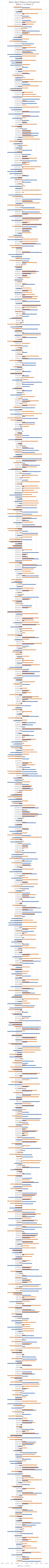
| Category | Stock 1 | Stock 2 |
|---|---|---|
| 1/1/16 | 0.19 | -0.05 |
| 1/2/16 | 0.07 | 0.2 |
| 1/3/16 | 0.07 | 0.03 |
| 1/4/16 | -0.11 | -0.01 |
| 1/5/16 | 0.09 | 0.19 |
| 1/6/16 | 0.02 | 0.03 |
| 1/7/16 | -0.14 | 0.15 |
| 1/8/16 | 0.03 | 0.09 |
| 1/9/16 | -0.06 | 0.05 |
| 1/10/16 | -0.01 | 0.15 |
| 1/11/16 | 0.06 | 0.09 |
| 1/12/16 | 0.04 | 0.17 |
| 1/13/16 | -0.08 | 0 |
| 1/14/16 | 0.11 | -0.02 |
| 1/15/16 | -0.15 | 0.02 |
| 1/16/16 | -0.02 | 0.02 |
| 1/17/16 | -0.07 | 0.1 |
| 1/18/16 | 0.14 | 0.03 |
| 1/19/16 | 0.19 | 0.09 |
| 1/20/16 | -0.06 | -0.04 |
| 1/21/16 | -0.03 | 0.11 |
| 1/22/16 | -0.05 | -0.13 |
| 1/23/16 | 0.1 | -0.07 |
| 1/24/16 | -0.07 | 0.15 |
| 1/25/16 | 0.11 | 0.05 |
| 1/26/16 | -0.1 | -0.14 |
| 1/27/16 | -0.04 | 0.01 |
| 1/28/16 | 0.06 | 0.2 |
| 1/29/16 | 0 | 0.1 |
| 1/30/16 | -0.12 | -0.09 |
| 1/31/16 | 0.01 | -0.11 |
| 2/1/16 | -0.03 | 0.15 |
| 2/2/16 | 0.2 | 0.11 |
| 2/3/16 | -0.05 | -0.01 |
| 2/4/16 | 0.04 | 0.13 |
| 2/5/16 | -0.09 | -0.11 |
| 2/6/16 | 0.08 | -0.01 |
| 2/7/16 | -0.04 | 0.09 |
| 2/8/16 | 0.06 | 0.2 |
| 2/9/16 | 0.01 | 0.12 |
| 2/10/16 | 0.09 | 0.08 |
| 2/11/16 | -0.15 | 0.01 |
| 2/12/16 | -0.04 | -0.11 |
| 2/13/16 | 0.2 | 0.13 |
| 2/14/16 | 0.17 | 0.16 |
| 2/15/16 | -0.03 | 0.15 |
| 2/16/16 | -0.12 | -0.05 |
| 2/17/16 | -0.13 | 0.04 |
| 2/18/16 | 0.09 | 0.01 |
| 2/19/16 | -0.06 | 0.19 |
| 2/20/16 | -0.07 | 0.13 |
| 2/21/16 | 0.15 | -0.02 |
| 2/22/16 | -0.09 | -0.05 |
| 2/23/16 | -0.03 | 0.05 |
| 2/24/16 | -0.04 | 0.03 |
| 2/25/16 | 0.11 | 0.13 |
| 2/26/16 | 0.14 | 0.04 |
| 2/27/16 | -0.01 | -0.13 |
| 2/28/16 | 0.19 | -0.15 |
| 2/29/16 | -0.12 | -0.12 |
| 3/1/16 | 0.17 | 0.13 |
| 3/2/16 | 0.03 | 0.07 |
| 3/3/16 | 0.12 | -0.01 |
| 3/4/16 | -0.03 | -0.06 |
| 3/5/16 | -0.01 | -0.02 |
| 3/6/16 | 0.1 | 0.13 |
| 3/7/16 | 0.11 | 0.06 |
| 3/8/16 | -0.14 | 0.05 |
| 3/9/16 | 0.01 | -0.14 |
| 3/10/16 | 0.09 | 0.01 |
| 3/11/16 | 0.02 | -0.1 |
| 3/12/16 | 0.14 | 0.11 |
| 3/13/16 | -0.11 | 0.02 |
| 3/14/16 | 0.03 | -0.09 |
| 3/15/16 | -0.15 | 0.19 |
| 3/16/16 | 0 | 0.15 |
| 3/17/16 | -0.15 | -0.07 |
| 3/18/16 | -0.07 | 0.04 |
| 3/19/16 | 0.06 | -0.1 |
| 3/20/16 | 0.13 | -0.02 |
| 3/21/16 | 0.02 | -0.1 |
| 3/22/16 | 0.04 | 0.07 |
| 3/23/16 | 0.01 | 0.17 |
| 3/24/16 | -0.13 | 0.18 |
| 3/25/16 | 0.17 | -0.12 |
| 3/26/16 | -0.03 | 0.19 |
| 3/27/16 | -0.08 | -0.12 |
| 3/28/16 | 0.06 | -0.15 |
| 3/29/16 | 0.13 | 0.1 |
| 3/30/16 | 0.1 | 0 |
| 3/31/16 | 0 | 0.2 |
| 4/1/16 | -0.02 | 0 |
| 4/2/16 | 0.1 | 0.09 |
| 4/3/16 | -0.15 | -0.05 |
| 4/4/16 | -0.07 | 0.14 |
| 4/5/16 | 0.15 | -0.11 |
| 4/6/16 | 0.14 | 0.01 |
| 4/7/16 | 0.02 | 0.02 |
| 4/8/16 | -0.1 | -0.11 |
| 4/9/16 | -0.03 | -0.12 |
| 4/10/16 | 0 | 0.18 |
| 4/11/16 | 0.03 | -0.13 |
| 4/12/16 | 0.08 | 0.1 |
| 4/13/16 | 0.15 | -0.11 |
| 4/14/16 | 0.04 | 0.01 |
| 4/15/16 | 0.2 | -0.13 |
| 4/16/16 | 0.12 | 0.03 |
| 4/17/16 | 0.01 | 0 |
| 4/18/16 | -0.04 | 0.12 |
| 4/19/16 | -0.11 | 0.12 |
| 4/20/16 | -0.15 | 0.08 |
| 4/21/16 | 0.02 | 0.08 |
| 4/22/16 | -0.07 | 0.14 |
| 4/23/16 | -0.11 | 0.06 |
| 4/24/16 | 0.07 | -0.04 |
| 4/25/16 | -0.1 | -0.01 |
| 4/26/16 | -0.06 | -0.11 |
| 4/27/16 | 0.16 | 0.18 |
| 4/28/16 | 0.13 | 0.09 |
| 4/29/16 | -0.07 | -0.14 |
| 4/30/16 | 0.09 | 0.19 |
| 5/1/16 | 0.02 | -0.06 |
| 5/2/16 | -0.13 | 0.08 |
| 5/3/16 | 0.13 | 0.14 |
| 5/4/16 | 0.02 | 0.14 |
| 5/5/16 | 0.09 | -0.09 |
| 5/6/16 | -0.09 | -0.15 |
| 5/7/16 | 0.17 | -0.02 |
| 5/8/16 | 0.2 | -0.08 |
| 5/9/16 | -0.03 | 0.17 |
| 5/10/16 | 0.19 | -0.14 |
| 5/11/16 | 0.05 | 0.1 |
| 5/12/16 | 0.08 | 0.09 |
| 5/13/16 | 0.05 | -0.07 |
| 5/14/16 | 0.2 | 0.04 |
| 5/15/16 | 0.01 | -0.03 |
| 5/16/16 | -0.06 | -0.12 |
| 5/17/16 | 0.17 | 0.09 |
| 5/18/16 | 0.08 | 0.1 |
| 5/19/16 | -0.15 | -0.01 |
| 5/20/16 | 0.1 | -0.03 |
| 5/21/16 | 0.04 | 0.08 |
| 5/22/16 | -0.1 | -0.08 |
| 5/23/16 | -0.06 | 0.1 |
| 5/24/16 | 0.02 | 0.12 |
| 5/25/16 | -0.1 | -0.03 |
| 5/26/16 | -0.1 | -0.1 |
| 5/27/16 | -0.13 | 0.14 |
| 5/28/16 | -0.01 | 0.07 |
| 5/29/16 | -0.05 | 0.17 |
| 5/30/16 | 0.11 | 0.11 |
| 5/31/16 | -0.06 | 0.16 |
| 6/1/16 | 0.08 | 0.13 |
| 6/2/16 | 0.14 | 0.16 |
| 6/3/16 | 0.16 | 0.03 |
| 6/4/16 | 0.02 | -0.15 |
| 6/5/16 | 0.13 | -0.08 |
| 6/6/16 | 0.2 | 0.04 |
| 6/7/16 | -0.14 | 0.2 |
| 6/8/16 | 0.15 | -0.05 |
| 6/9/16 | 0.12 | 0.16 |
| 6/10/16 | -0.14 | 0.09 |
| 6/11/16 | 0.13 | 0.04 |
| 6/12/16 | 0.14 | 0.19 |
| 6/13/16 | 0.13 | -0.15 |
| 6/14/16 | -0.09 | 0.14 |
| 6/15/16 | -0.13 | -0.07 |
| 6/16/16 | -0.01 | -0.07 |
| 6/17/16 | 0.11 | -0.12 |
| 6/18/16 | 0.14 | -0.15 |
| 6/19/16 | 0.08 | 0.1 |
| 6/20/16 | -0.14 | 0.1 |
| 6/21/16 | 0.13 | 0.15 |
| 6/22/16 | 0.15 | 0 |
| 6/23/16 | -0.04 | -0.06 |
| 6/24/16 | 0.06 | -0.12 |
| 6/25/16 | -0.09 | 0.1 |
| 6/26/16 | 0.09 | -0.12 |
| 6/27/16 | 0.17 | 0.12 |
| 6/28/16 | 0 | 0.08 |
| 6/29/16 | 0.1 | 0 |
| 6/30/16 | -0.06 | -0.15 |
| 7/1/16 | 0.09 | 0.02 |
| 7/2/16 | -0.03 | -0.05 |
| 7/3/16 | -0.12 | -0.08 |
| 7/4/16 | 0.18 | 0.07 |
| 7/5/16 | 0.03 | -0.04 |
| 7/6/16 | -0.08 | 0.18 |
| 7/7/16 | -0.01 | 0.19 |
| 7/8/16 | 0 | -0.02 |
| 7/9/16 | 0.11 | -0.06 |
| 7/10/16 | 0.1 | -0.13 |
| 7/11/16 | 0.01 | -0.05 |
| 7/12/16 | 0.03 | -0.02 |
| 7/13/16 | 0.19 | -0.14 |
| 7/14/16 | 0.01 | 0.08 |
| 7/15/16 | -0.07 | -0.11 |
| 7/16/16 | 0.14 | 0.16 |
| 7/17/16 | -0.06 | 0.18 |
| 7/18/16 | 0.13 | -0.05 |
| 7/19/16 | 0.03 | 0.06 |
| 7/20/16 | 0.02 | 0.06 |
| 7/21/16 | 0.14 | 0.16 |
| 7/22/16 | 0.03 | 0.05 |
| 7/23/16 | 0.06 | -0.14 |
| 7/24/16 | -0.06 | 0.07 |
| 7/25/16 | 0.06 | -0.03 |
| 7/26/16 | 0.04 | 0.18 |
| 7/27/16 | 0.19 | -0.07 |
| 7/28/16 | 0.06 | -0.1 |
| 7/29/16 | 0.2 | -0.05 |
| 7/30/16 | 0.07 | -0.04 |
| 7/31/16 | -0.1 | 0.04 |
| 8/1/16 | -0.06 | -0.08 |
| 8/2/16 | 0.12 | 0.12 |
| 8/3/16 | -0.08 | 0.09 |
| 8/4/16 | 0.18 | 0 |
| 8/5/16 | -0.13 | -0.06 |
| 8/6/16 | -0.06 | 0.17 |
| 8/7/16 | 0.09 | 0.18 |
| 8/8/16 | 0.01 | -0.09 |
| 8/9/16 | 0.1 | 0.15 |
| 8/10/16 | 0.04 | -0.04 |
| 8/11/16 | 0.06 | 0.08 |
| 8/12/16 | -0.14 | 0.18 |
| 8/13/16 | -0.03 | -0.11 |
| 8/14/16 | 0 | 0.07 |
| 8/15/16 | 0.16 | -0.13 |
| 8/16/16 | -0.02 | -0.03 |
| 8/17/16 | 0.15 | 0.18 |
| 8/18/16 | -0.01 | -0.14 |
| 8/19/16 | -0.09 | -0.11 |
| 8/20/16 | 0.2 | -0.12 |
| 8/21/16 | 0.14 | 0.04 |
| 8/22/16 | 0.06 | -0.1 |
| 8/23/16 | 0.12 | -0.08 |
| 8/24/16 | 0.01 | -0.02 |
| 8/25/16 | -0.13 | -0.07 |
| 8/26/16 | -0.05 | -0.13 |
| 8/27/16 | -0.05 | 0.13 |
| 8/28/16 | -0.09 | 0.19 |
| 8/29/16 | -0.04 | 0.18 |
| 8/30/16 | 0.19 | 0 |
| 8/31/16 | -0.11 | -0.14 |
| 9/1/16 | 0.05 | 0.15 |
| 9/2/16 | -0.07 | 0.15 |
| 9/3/16 | 0.13 | 0.15 |
| 9/4/16 | -0.11 | -0.1 |
| 9/5/16 | 0.18 | 0 |
| 9/6/16 | -0.15 | 0.03 |
| 9/7/16 | 0.19 | 0.17 |
| 9/8/16 | 0.19 | -0.08 |
| 9/9/16 | -0.14 | -0.1 |
| 9/10/16 | -0.13 | -0.14 |
| 9/11/16 | 0.19 | -0.03 |
| 9/12/16 | 0.01 | 0.07 |
| 9/13/16 | 0.09 | -0.01 |
| 9/14/16 | -0.09 | -0.11 |
| 9/15/16 | 0.06 | 0.01 |
| 9/16/16 | -0.02 | -0.14 |
| 9/17/16 | -0.13 | 0.12 |
| 9/18/16 | 0.13 | -0.08 |
| 9/19/16 | -0.15 | 0.08 |
| 9/20/16 | -0.04 | 0.05 |
| 9/21/16 | 0.01 | 0.17 |
| 9/22/16 | -0.11 | -0.1 |
| 9/23/16 | -0.08 | 0.19 |
| 9/24/16 | 0.13 | 0.08 |
| 9/25/16 | 0.06 | -0.14 |
| 9/26/16 | 0.12 | 0.08 |
| 9/27/16 | -0.12 | 0.2 |
| 9/28/16 | 0 | -0.02 |
| 9/29/16 | 0.16 | 0.07 |
| 9/30/16 | 0.03 | 0.17 |
| 10/1/16 | -0.07 | -0.03 |
| 10/2/16 | 0.09 | -0.06 |
| 10/3/16 | -0.11 | 0.05 |
| 10/4/16 | -0.07 | 0.07 |
| 10/5/16 | -0.11 | -0.12 |
| 10/6/16 | -0.06 | 0.08 |
| 10/7/16 | -0.1 | -0.13 |
| 10/8/16 | 0.12 | -0.02 |
| 10/9/16 | 0.19 | 0.11 |
| 10/10/16 | -0.03 | 0.19 |
| 10/11/16 | -0.1 | 0.07 |
| 10/12/16 | 0.08 | 0.17 |
| 10/13/16 | -0.03 | -0.02 |
| 10/14/16 | -0.01 | -0.05 |
| 10/15/16 | -0.04 | 0.14 |
| 10/16/16 | -0.12 | 0.07 |
| 10/17/16 | 0.07 | 0.01 |
| 10/18/16 | -0.11 | -0.05 |
| 10/19/16 | -0.08 | 0.14 |
| 10/20/16 | 0.02 | 0 |
| 10/21/16 | -0.01 | 0.14 |
| 10/22/16 | 0.02 | 0.05 |
| 10/23/16 | 0.12 | -0.06 |
| 10/24/16 | 0.06 | 0.14 |
| 10/25/16 | -0.03 | 0.15 |
| 10/26/16 | -0.14 | 0 |
| 10/27/16 | -0.14 | 0.15 |
| 10/28/16 | -0.12 | 0.11 |
| 10/29/16 | -0.11 | 0.01 |
| 10/30/16 | 0.03 | -0.08 |
| 10/31/16 | 0.13 | 0.13 |
| 11/1/16 | 0.2 | 0 |
| 11/2/16 | 0.11 | 0.06 |
| 11/3/16 | 0.19 | 0.14 |
| 11/4/16 | 0.04 | -0.1 |
| 11/5/16 | -0.02 | -0.03 |
| 11/6/16 | 0.17 | 0.01 |
| 11/7/16 | -0.01 | -0.03 |
| 11/8/16 | 0.13 | 0.07 |
| 11/9/16 | 0.07 | 0.14 |
| 11/10/16 | 0.08 | -0.14 |
| 11/11/16 | -0.06 | 0.03 |
| 11/12/16 | 0.07 | -0.02 |
| 11/13/16 | 0.12 | -0.11 |
| 11/14/16 | -0.01 | 0.16 |
| 11/15/16 | 0.06 | 0.05 |
| 11/16/16 | -0.06 | 0.16 |
| 11/17/16 | -0.11 | 0.06 |
| 11/18/16 | -0.03 | 0.03 |
| 11/19/16 | 0.15 | 0.1 |
| 11/20/16 | -0.13 | 0 |
| 11/21/16 | -0.1 | 0.12 |
| 11/22/16 | -0.02 | -0.05 |
| 11/23/16 | 0.09 | 0.08 |
| 11/24/16 | 0.09 | -0.11 |
| 11/25/16 | 0.1 | 0.02 |
| 11/26/16 | 0.16 | -0.13 |
| 11/27/16 | -0.11 | 0.06 |
| 11/28/16 | -0.11 | 0.02 |
| 11/29/16 | 0.14 | -0.07 |
| 11/30/16 | 0.02 | 0 |
| 12/1/16 | 0.01 | 0.06 |
| 12/2/16 | 0.06 | 0.06 |
| 12/3/16 | 0.09 | -0.04 |
| 12/4/16 | -0.12 | 0.02 |
| 12/5/16 | -0.02 | -0.12 |
| 12/6/16 | -0.1 | 0.2 |
| 12/7/16 | 0.09 | -0.15 |
| 12/8/16 | -0.1 | 0.05 |
| 12/9/16 | -0.13 | -0.05 |
| 12/10/16 | 0.07 | 0.06 |
| 12/11/16 | -0.14 | 0 |
| 12/12/16 | -0.07 | -0.05 |
| 12/13/16 | 0.14 | 0.04 |
| 12/14/16 | -0.06 | -0.01 |
| 12/15/16 | -0.04 | 0.02 |
| 12/16/16 | 0.13 | 0.16 |
| 12/17/16 | 0.2 | 0.16 |
| 12/18/16 | 0.08 | 0.07 |
| 12/19/16 | 0.05 | 0.01 |
| 12/20/16 | 0.17 | 0.13 |
| 12/21/16 | -0.12 | 0.13 |
| 12/22/16 | -0.03 | -0.1 |
| 12/23/16 | -0.11 | 0.06 |
| 12/24/16 | -0.14 | -0.06 |
| 12/25/16 | 0 | -0.15 |
| 12/26/16 | -0.12 | -0.1 |
| 12/27/16 | 0 | -0.05 |
| 12/28/16 | -0.03 | 0.1 |
| 12/29/16 | 0.11 | 0.08 |
| 12/30/16 | 0.09 | 0.1 |
| 12/31/16 | 0.07 | -0.07 |
| 1/1/17 | -0.15 | 0.08 |
| 1/2/17 | -0.08 | 0.02 |
| 1/3/17 | -0.09 | -0.04 |
| 1/4/17 | 0.2 | 0.06 |
| 1/5/17 | 0.16 | -0.14 |
| 1/6/17 | 0.15 | -0.15 |
| 1/7/17 | 0.14 | 0.02 |
| 1/8/17 | 0.08 | -0.03 |
| 1/9/17 | 0.04 | 0.13 |
| 1/10/17 | 0.06 | 0.1 |
| 1/11/17 | 0 | 0 |
| 1/12/17 | 0.07 | -0.14 |
| 1/13/17 | 0.03 | -0.15 |
| 1/14/17 | -0.14 | 0.07 |
| 1/15/17 | -0.12 | 0.15 |
| 1/16/17 | -0.06 | 0.12 |
| 1/17/17 | -0.02 | -0.11 |
| 1/18/17 | -0.12 | 0.09 |
| 1/19/17 | -0.09 | 0.02 |
| 1/20/17 | -0.11 | 0.05 |
| 1/21/17 | 0.09 | 0.14 |
| 1/22/17 | 0.01 | 0.03 |
| 1/23/17 | 0.12 | 0.07 |
| 1/24/17 | -0.04 | 0 |
| 1/25/17 | 0.12 | -0.02 |
| 1/26/17 | 0.2 | 0.19 |
| 1/27/17 | 0.03 | -0.01 |
| 1/28/17 | 0.11 | 0.04 |
| 1/29/17 | 0.14 | 0.04 |
| 1/30/17 | -0.09 | 0.05 |
| 1/31/17 | -0.01 | -0.14 |
| 2/1/17 | 0.17 | 0.07 |
| 2/2/17 | -0.05 | -0.03 |
| 2/3/17 | 0.01 | 0.1 |
| 2/4/17 | -0.02 | -0.1 |
| 2/5/17 | -0.07 | 0 |
| 2/6/17 | 0.09 | -0.15 |
| 2/7/17 | -0.01 | -0.02 |
| 2/8/17 | 0.16 | 0.03 |
| 2/9/17 | 0.06 | 0.2 |
| 2/10/17 | 0.1 | 0.17 |
| 2/11/17 | -0.03 | -0.13 |
| 2/12/17 | 0.04 | 0.09 |
| 2/13/17 | 0.06 | 0.08 |
| 2/14/17 | -0.02 | 0.05 |
| 2/15/17 | 0 | -0.02 |
| 2/16/17 | 0.08 | -0.09 |
| 2/17/17 | -0.02 | 0.13 |
| 2/18/17 | -0.06 | -0.06 |
| 2/19/17 | -0.09 | 0.01 |
| 2/20/17 | 0.18 | -0.05 |
| 2/21/17 | 0.13 | 0.12 |
| 2/22/17 | 0.18 | 0.06 |
| 2/23/17 | 0.07 | -0.15 |
| 2/24/17 | -0.13 | -0.01 |
| 2/25/17 | 0.09 | 0.18 |
| 2/26/17 | -0.05 | 0.11 |
| 2/27/17 | 0.01 | 0.12 |
| 2/28/17 | 0.02 | -0.06 |
| 3/1/17 | -0.05 | 0.07 |
| 3/2/17 | 0 | -0.07 |
| 3/3/17 | -0.02 | -0.1 |
| 3/4/17 | -0.09 | 0.14 |
| 3/5/17 | -0.04 | 0.04 |
| 3/6/17 | 0.07 | -0.14 |
| 3/7/17 | 0.12 | 0.2 |
| 3/8/17 | 0 | 0.02 |
| 3/9/17 | -0.08 | 0.07 |
| 3/10/17 | 0.17 | 0.13 |
| 3/11/17 | -0.05 | -0.15 |
| 3/12/17 | -0.01 | 0.03 |
| 3/13/17 | -0.02 | 0.12 |
| 3/14/17 | -0.03 | 0.1 |
| 3/15/17 | -0.12 | -0.03 |
| 3/16/17 | 0.14 | 0.18 |
| 3/17/17 | -0.09 | 0.17 |
| 3/18/17 | 0.02 | 0.12 |
| 3/19/17 | 0.11 | 0.17 |
| 3/20/17 | 0 | -0.01 |
| 3/21/17 | -0.06 | 0.16 |
| 3/22/17 | -0.15 | -0.15 |
| 3/23/17 | 0 | 0 |
| 3/24/17 | 0.06 | 0.09 |
| 3/25/17 | 0.1 | -0.02 |
| 3/26/17 | 0.01 | -0.07 |
| 3/27/17 | -0.06 | -0.1 |
| 3/28/17 | 0.07 | 0.09 |
| 3/29/17 | 0.17 | -0.08 |
| 3/30/17 | -0.04 | 0.02 |
| 3/31/17 | 0 | -0.05 |
| 4/1/17 | 0.07 | 0.11 |
| 4/2/17 | -0.13 | 0.12 |
| 4/3/17 | -0.05 | 0.01 |
| 4/4/17 | 0.14 | -0.04 |
| 4/5/17 | -0.11 | -0.08 |
| 4/6/17 | 0 | -0.11 |
| 4/7/17 | 0 | 0.17 |
| 4/8/17 | 0.17 | 0.03 |
| 4/9/17 | -0.04 | 0.12 |
| 4/10/17 | 0 | 0.09 |
| 4/11/17 | -0.08 | 0.12 |
| 4/12/17 | 0.14 | 0.01 |
| 4/13/17 | 0.2 | 0.15 |
| 4/14/17 | -0.03 | -0.13 |
| 4/15/17 | -0.07 | 0.1 |
| 4/16/17 | 0.17 | 0.12 |
| 4/17/17 | 0.06 | 0.04 |
| 4/18/17 | 0.04 | 0.06 |
| 4/19/17 | 0.17 | 0 |
| 4/20/17 | 0.01 | 0.1 |
| 4/21/17 | -0.15 | -0.14 |
| 4/22/17 | -0.09 | -0.1 |
| 4/23/17 | -0.07 | -0.04 |
| 4/24/17 | -0.12 | -0.14 |
| 4/25/17 | 0.1 | -0.13 |
| 4/26/17 | -0.01 | 0.1 |
| 4/27/17 | -0.05 | 0.16 |
| 4/28/17 | 0.16 | -0.02 |
| 4/29/17 | 0.06 | -0.14 |
| 4/30/17 | -0.04 | -0.15 |
| 5/1/17 | 0.2 | 0.2 |
| 5/2/17 | 0.13 | 0 |
| 5/3/17 | -0.09 | 0.11 |
| 5/4/17 | 0.07 | 0.03 |
| 5/5/17 | 0.15 | 0.09 |
| 5/6/17 | -0.14 | 0.2 |
| 5/7/17 | 0.1 | -0.15 |
| 5/8/17 | 0.16 | -0.02 |
| 5/9/17 | -0.09 | -0.15 |
| 5/10/17 | 0.15 | -0.06 |
| 5/11/17 | -0.05 | 0.15 |
| 5/12/17 | -0.03 | 0.17 |
| 5/13/17 | -0.08 | 0.16 |
| 5/14/17 | -0.05 | -0.02 |
| 5/15/17 | -0.07 | 0.14 |
| 5/16/17 | -0.13 | 0.1 |
| 5/17/17 | -0.08 | 0.16 |
| 5/18/17 | 0.01 | 0.12 |
| 5/19/17 | 0.01 | 0.18 |
| 5/20/17 | 0.02 | 0.16 |
| 5/21/17 | -0.01 | -0.05 |
| 5/22/17 | -0.01 | 0.18 |
| 5/23/17 | 0.06 | 0 |
| 5/24/17 | -0.02 | 0.08 |
| 5/25/17 | 0.01 | 0.16 |
| 5/26/17 | 0.09 | -0.03 |
| 5/27/17 | 0.19 | 0.05 |
| 5/28/17 | -0.14 | -0.11 |
| 5/29/17 | 0.04 | 0.15 |
| 5/30/17 | 0.18 | 0.06 |
| 5/31/17 | 0.03 | -0.09 |
| 6/1/17 | 0.14 | 0.2 |
| 6/2/17 | 0.2 | -0.13 |
| 6/3/17 | -0.09 | -0.05 |
| 6/4/17 | -0.07 | 0.2 |
| 6/5/17 | 0.13 | -0.08 |
| 6/6/17 | 0.17 | -0.09 |
| 6/7/17 | 0.12 | 0.06 |
| 6/8/17 | 0.04 | -0.02 |
| 6/9/17 | -0.04 | -0.04 |
| 6/10/17 | -0.01 | 0.16 |
| 6/11/17 | -0.14 | -0.07 |
| 6/12/17 | 0.2 | -0.06 |
| 6/13/17 | 0.07 | -0.08 |
| 6/14/17 | -0.04 | -0.05 |
| 6/15/17 | 0.01 | 0 |
| 6/16/17 | -0.09 | -0.01 |
| 6/17/17 | -0.02 | 0.07 |
| 6/18/17 | -0.03 | 0.13 |
| 6/19/17 | 0.13 | 0.03 |
| 6/20/17 | -0.05 | -0.12 |
| 6/21/17 | 0.16 | -0.15 |
| 6/22/17 | 0.03 | 0.12 |
| 6/23/17 | -0.12 | 0.2 |
| 6/24/17 | 0 | 0.12 |
| 6/25/17 | -0.13 | -0.03 |
| 6/26/17 | 0.13 | -0.09 |
| 6/27/17 | 0.05 | 0.14 |
| 6/28/17 | -0.02 | 0.05 |
| 6/29/17 | 0.08 | 0.17 |
| 6/30/17 | 0.06 | -0.04 |
| 7/1/17 | -0.01 | 0.13 |
| 7/2/17 | -0.12 | 0.03 |
| 7/3/17 | -0.05 | 0.02 |
| 7/4/17 | 0.1 | 0.02 |
| 7/5/17 | -0.1 | -0.08 |
| 7/6/17 | 0.08 | 0 |
| 7/7/17 | 0.12 | 0.01 |
| 7/8/17 | 0.2 | -0.01 |
| 7/9/17 | -0.1 | 0.06 |
| 7/10/17 | -0.01 | 0.12 |
| 7/11/17 | 0.07 | 0.02 |
| 7/12/17 | -0.12 | -0.12 |
| 7/13/17 | 0.09 | 0.02 |
| 7/14/17 | -0.12 | 0.01 |
| 7/15/17 | -0.05 | -0.09 |
| 7/16/17 | 0.14 | 0.02 |
| 7/17/17 | 0.14 | -0.02 |
| 7/18/17 | -0.04 | -0.13 |
| 7/19/17 | 0.2 | 0.06 |
| 7/20/17 | 0.03 | 0.17 |
| 7/21/17 | -0.01 | -0.05 |
| 7/22/17 | 0.05 | 0.01 |
| 7/23/17 | -0.11 | -0.06 |
| 7/24/17 | -0.02 | -0.04 |
| 7/25/17 | 0.06 | -0.12 |
| 7/26/17 | 0 | 0.08 |
| 7/27/17 | -0.09 | -0.15 |
| 7/28/17 | -0.01 | -0.04 |
| 7/29/17 | 0.15 | 0.04 |
| 7/30/17 | -0.08 | 0.19 |
| 7/31/17 | 0.19 | 0.02 |
| 8/1/17 | -0.08 | -0.07 |
| 8/2/17 | 0.16 | -0.1 |
| 8/3/17 | -0.12 | -0.02 |
| 8/4/17 | 0.18 | -0.15 |
| 8/5/17 | -0.02 | 0.02 |
| 8/6/17 | 0.01 | 0.01 |
| 8/7/17 | -0.13 | -0.1 |
| 8/8/17 | 0.07 | -0.02 |
| 8/9/17 | 0.15 | 0.03 |
| 8/10/17 | 0.03 | -0.07 |
| 8/11/17 | 0.16 | 0.08 |
| 8/12/17 | 0.02 | 0.15 |
| 8/13/17 | 0.19 | 0.19 |
| 8/14/17 | -0.06 | -0.01 |
| 8/15/17 | 0.18 | 0.04 |
| 8/16/17 | -0.12 | 0.15 |
| 8/17/17 | 0.1 | 0.16 |
| 8/18/17 | 0.03 | 0.13 |
| 8/19/17 | -0.08 | 0.1 |
| 8/20/17 | 0.06 | 0.1 |
| 8/21/17 | -0.06 | 0.09 |
| 8/22/17 | -0.01 | 0.02 |
| 8/23/17 | 0.13 | 0.04 |
| 8/24/17 | 0 | -0.05 |
| 8/25/17 | -0.08 | 0.01 |
| 8/26/17 | -0.04 | 0.08 |
| 8/27/17 | 0.05 | 0.05 |
| 8/28/17 | 0.09 | 0.14 |
| 8/29/17 | 0.17 | 0.14 |
| 8/30/17 | -0.06 | 0 |
| 8/31/17 | -0.06 | -0.08 |
| 9/1/17 | -0.01 | 0.04 |
| 9/2/17 | 0.04 | 0.15 |
| 9/3/17 | 0.07 | -0.13 |
| 9/4/17 | 0.08 | -0.07 |
| 9/5/17 | -0.11 | 0 |
| 9/6/17 | -0.14 | 0.02 |
| 9/7/17 | 0.2 | 0.08 |
| 9/8/17 | 0 | -0.01 |
| 9/9/17 | -0.06 | -0.11 |
| 9/10/17 | 0.12 | -0.13 |
| 9/11/17 | 0.19 | 0.14 |
| 9/12/17 | -0.02 | 0.16 |
| 9/13/17 | -0.15 | 0.16 |
| 9/14/17 | 0.01 | -0.14 |
| 9/15/17 | -0.09 | 0 |
| 9/16/17 | -0.04 | 0.09 |
| 9/17/17 | 0.08 | 0.07 |
| 9/18/17 | 0.1 | 0.09 |
| 9/19/17 | 0.15 | -0.1 |
| 9/20/17 | 0.2 | 0.2 |
| 9/21/17 | 0.05 | 0.08 |
| 9/22/17 | -0.11 | 0.17 |
| 9/23/17 | 0.19 | 0.2 |
| 9/24/17 | -0.13 | -0.1 |
| 9/25/17 | 0.06 | 0.2 |
| 9/26/17 | 0.18 | 0.01 |
| 9/27/17 | -0.15 | 0.19 |
| 9/28/17 | 0.13 | -0.02 |
| 9/29/17 | 0.02 | -0.15 |
| 9/30/17 | -0.06 | 0.18 |
| 10/1/17 | 0.11 | 0.1 |
| 10/2/17 | 0.19 | 0 |
| 10/3/17 | 0.01 | -0.1 |
| 10/4/17 | -0.14 | 0.2 |
| 10/5/17 | 0 | 0.02 |
| 10/6/17 | 0 | 0.19 |
| 10/7/17 | -0.07 | 0.01 |
| 10/8/17 | -0.13 | 0.03 |
| 10/9/17 | 0.01 | -0.04 |
| 10/10/17 | 0.09 | 0.01 |
| 10/11/17 | 0.15 | -0.07 |
| 10/12/17 | -0.12 | -0.04 |
| 10/13/17 | 0.07 | 0.04 |
| 10/14/17 | -0.13 | 0.01 |
| 10/15/17 | -0.15 | -0.04 |
| 10/16/17 | -0.12 | 0.13 |
| 10/17/17 | 0.01 | 0.19 |
| 10/18/17 | -0.11 | 0.07 |
| 10/19/17 | 0.04 | 0.08 |
| 10/20/17 | 0.15 | -0.02 |
| 10/21/17 | 0.07 | 0.15 |
| 10/22/17 | 0.05 | 0.06 |
| 10/23/17 | 0.09 | -0.01 |
| 10/24/17 | -0.15 | -0.05 |
| 10/25/17 | 0.1 | -0.03 |
| 10/26/17 | -0.06 | -0.01 |
| 10/27/17 | -0.04 | 0.05 |
| 10/28/17 | -0.09 | 0.01 |
| 10/29/17 | -0.03 | -0.13 |
| 10/30/17 | -0.05 | 0.18 |
| 10/31/17 | -0.04 | 0.12 |
| 11/1/17 | 0.16 | 0.09 |
| 11/2/17 | 0.17 | 0.09 |
| 11/3/17 | 0.09 | 0.09 |
| 11/4/17 | 0.05 | -0.02 |
| 11/5/17 | -0.05 | -0.11 |
| 11/6/17 | -0.03 | 0.15 |
| 11/7/17 | 0.05 | 0.04 |
| 11/8/17 | 0.07 | -0.02 |
| 11/9/17 | -0.1 | 0.04 |
| 11/10/17 | 0.17 | 0.08 |
| 11/11/17 | -0.14 | 0.01 |
| 11/12/17 | 0.18 | 0.07 |
| 11/13/17 | -0.11 | 0 |
| 11/14/17 | -0.13 | 0.17 |
| 11/15/17 | 0 | 0.04 |
| 11/16/17 | 0.15 | -0.01 |
| 11/17/17 | 0.13 | 0.04 |
| 11/18/17 | 0.18 | 0 |
| 11/19/17 | -0.1 | 0.19 |
| 11/20/17 | 0.01 | 0.14 |
| 11/21/17 | 0.02 | 0.11 |
| 11/22/17 | -0.11 | -0.13 |
| 11/23/17 | -0.12 | 0.06 |
| 11/24/17 | -0.04 | 0.17 |
| 11/25/17 | 0.08 | -0.01 |
| 11/26/17 | 0.06 | 0.2 |
| 11/27/17 | -0.07 | 0.12 |
| 11/28/17 | -0.07 | 0.03 |
| 11/29/17 | 0.01 | -0.1 |
| 11/30/17 | 0.08 | 0.06 |
| 12/1/17 | -0.04 | 0.14 |
| 12/2/17 | -0.06 | -0.03 |
| 12/3/17 | 0.06 | 0.01 |
| 12/4/17 | -0.12 | 0.08 |
| 12/5/17 | -0.11 | -0.06 |
| 12/6/17 | -0.12 | 0.14 |
| 12/7/17 | -0.07 | -0.02 |
| 12/8/17 | -0.13 | 0.14 |
| 12/9/17 | -0.15 | 0.17 |
| 12/10/17 | 0.11 | 0.09 |
| 12/11/17 | 0.14 | -0.06 |
| 12/12/17 | 0.04 | 0.14 |
| 12/13/17 | -0.15 | 0.09 |
| 12/14/17 | 0.12 | -0.01 |
| 12/15/17 | 0.05 | -0.13 |
| 12/16/17 | -0.1 | 0.07 |
| 12/17/17 | -0.09 | -0.04 |
| 12/18/17 | -0.02 | 0.2 |
| 12/19/17 | 0.06 | 0.08 |
| 12/20/17 | 0.18 | 0.03 |
| 12/21/17 | -0.01 | 0.05 |
| 12/22/17 | 0.1 | -0.15 |
| 12/23/17 | 0.04 | 0.12 |
| 12/24/17 | 0.03 | 0.14 |
| 12/25/17 | 0.09 | 0 |
| 12/26/17 | 0.01 | 0.09 |
| 12/27/17 | 0.07 | -0.01 |
| 12/28/17 | 0.02 | 0.16 |
| 12/29/17 | -0.06 | -0.04 |
| 12/30/17 | -0.02 | 0.2 |
| 12/31/17 | 0.08 | -0.09 |